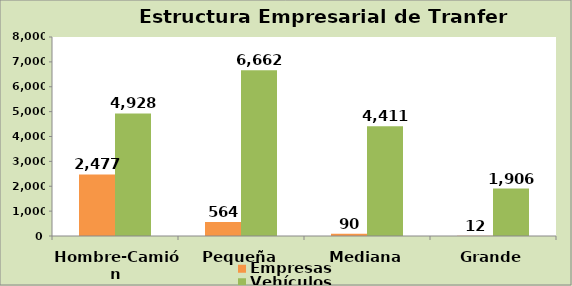
| Category | Empresas | Vehículos |
|---|---|---|
| Hombre-Camión | 2477 | 4928 |
| Pequeña | 564 | 6662 |
| Mediana | 90 | 4411 |
| Grande | 12 | 1906 |